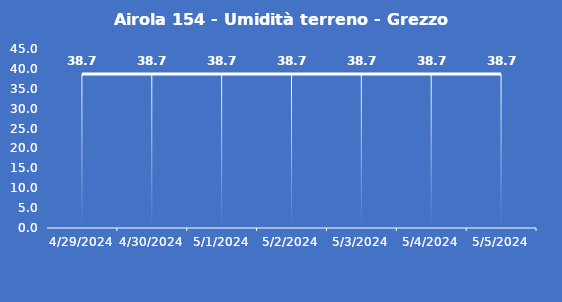
| Category | Airola 154 - Umidità terreno - Grezzo (%VWC) |
|---|---|
| 4/29/24 | 38.7 |
| 4/30/24 | 38.7 |
| 5/1/24 | 38.7 |
| 5/2/24 | 38.7 |
| 5/3/24 | 38.7 |
| 5/4/24 | 38.7 |
| 5/5/24 | 38.7 |